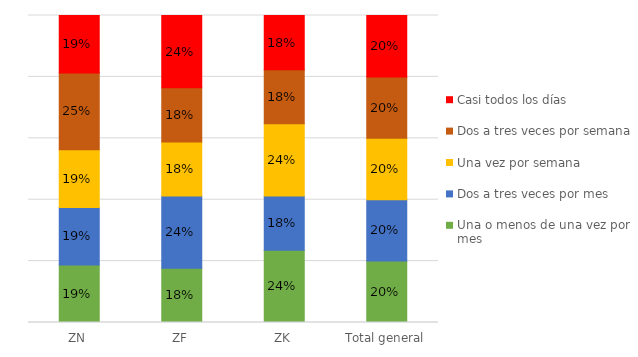
| Category | Una o menos de una vez por mes | Dos a tres veces por mes | Una vez por semana | Dos a tres veces por semana | Casi todos los días  |
|---|---|---|---|---|---|
| ZN | 0.188 | 0.188 | 0.188 | 0.25 | 0.188 |
| ZF | 0.176 | 0.235 | 0.176 | 0.176 | 0.235 |
| ZK | 0.235 | 0.176 | 0.235 | 0.176 | 0.176 |
| Total general | 0.2 | 0.2 | 0.2 | 0.2 | 0.2 |